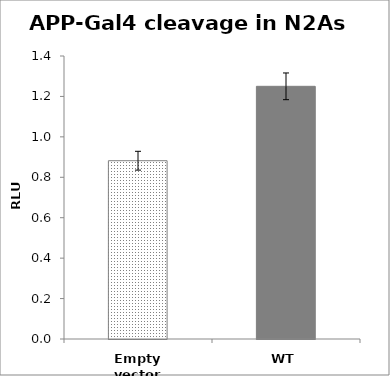
| Category | Series 0 |
|---|---|
| Empty vector | 0.882 |
| WT | 1.25 |